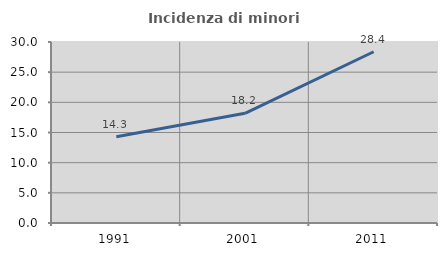
| Category | Incidenza di minori stranieri |
|---|---|
| 1991.0 | 14.286 |
| 2001.0 | 18.182 |
| 2011.0 | 28.387 |